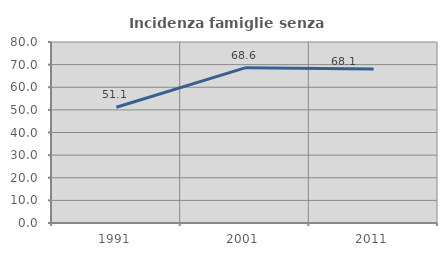
| Category | Incidenza famiglie senza nuclei |
|---|---|
| 1991.0 | 51.145 |
| 2001.0 | 68.571 |
| 2011.0 | 68.116 |